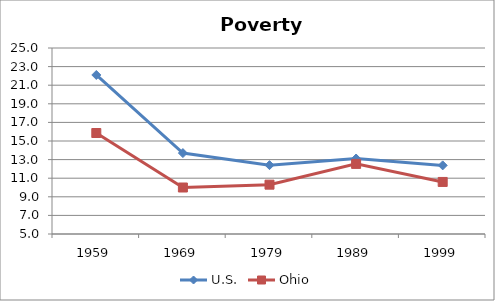
| Category | U.S. | Ohio |
|---|---|---|
| 1959 | 22.1 | 15.86 |
| 1969 | 13.7 | 10 |
| 1979 | 12.403 | 10.304 |
| 1989 | 13.118 | 12.538 |
| 1999 | 12.378 | 10.597 |